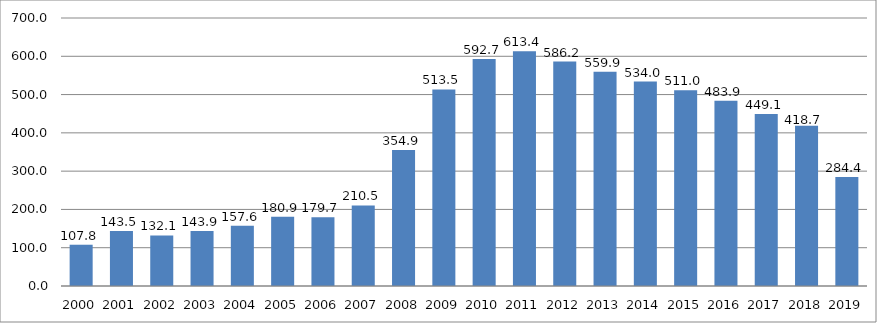
| Category | Disbursed Outstanding Debt |
|---|---|
| 2000.0 | 107.8 |
| 2001.0 | 143.5 |
| 2002.0 | 132.1 |
| 2003.0 | 143.9 |
| 2004.0 | 157.6 |
| 2005.0 | 180.9 |
| 2006.0 | 179.7 |
| 2007.0 | 210.5 |
| 2008.0 | 354.9 |
| 2009.0 | 513.5 |
| 2010.0 | 592.7 |
| 2011.0 | 613.4 |
| 2012.0 | 586.2 |
| 2013.0 | 559.9 |
| 2014.0 | 534 |
| 2015.0 | 511 |
| 2016.0 | 483.868 |
| 2017.0 | 449.148 |
| 2018.0 | 418.664 |
| 2019.0 | 284.381 |